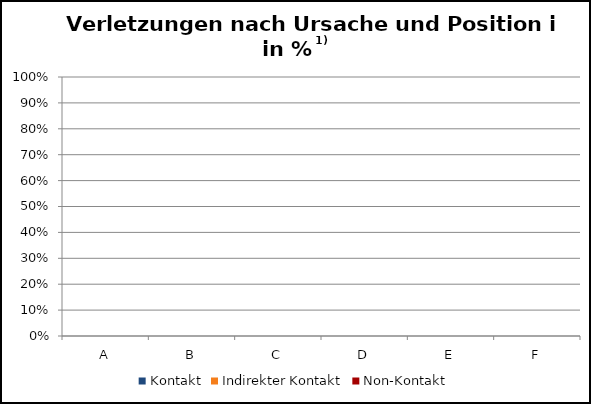
| Category | Kontakt | Indirekter Kontakt | Non-Kontakt |
|---|---|---|---|
| A | 0 | 0 | 0 |
| B | 0 | 0 | 0 |
| C | 0 | 0 | 0 |
| D | 0 | 0 | 0 |
| E | 0 | 0 | 0 |
| F | 0 | 0 | 0 |